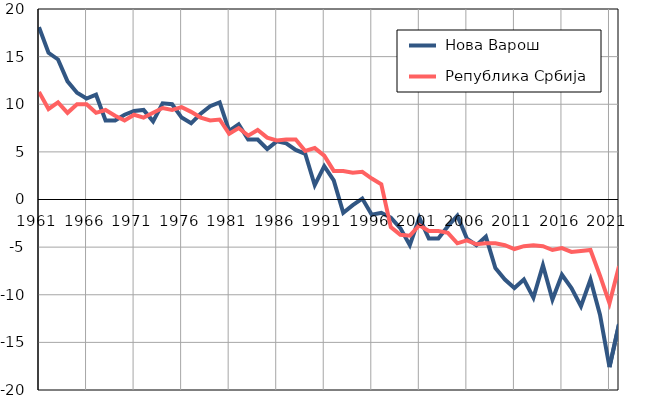
| Category |  Нова Варош |  Република Србија |
|---|---|---|
| 1961.0 | 18.1 | 11.3 |
| 1962.0 | 15.4 | 9.5 |
| 1963.0 | 14.7 | 10.2 |
| 1964.0 | 12.4 | 9.1 |
| 1965.0 | 11.2 | 10 |
| 1966.0 | 10.6 | 10 |
| 1967.0 | 11 | 9.1 |
| 1968.0 | 8.3 | 9.4 |
| 1969.0 | 8.3 | 8.8 |
| 1970.0 | 8.9 | 8.3 |
| 1971.0 | 9.3 | 8.9 |
| 1972.0 | 9.4 | 8.6 |
| 1973.0 | 8.2 | 9.1 |
| 1974.0 | 10.1 | 9.6 |
| 1975.0 | 10 | 9.4 |
| 1976.0 | 8.6 | 9.7 |
| 1977.0 | 8 | 9.2 |
| 1978.0 | 9 | 8.6 |
| 1979.0 | 9.8 | 8.3 |
| 1980.0 | 10.2 | 8.4 |
| 1981.0 | 7.2 | 6.9 |
| 1982.0 | 7.9 | 7.5 |
| 1983.0 | 6.3 | 6.7 |
| 1984.0 | 6.3 | 7.3 |
| 1985.0 | 5.3 | 6.5 |
| 1986.0 | 6.1 | 6.2 |
| 1987.0 | 5.9 | 6.3 |
| 1988.0 | 5.2 | 6.3 |
| 1989.0 | 4.8 | 5.1 |
| 1990.0 | 1.5 | 5.4 |
| 1991.0 | 3.5 | 4.6 |
| 1992.0 | 2 | 3 |
| 1993.0 | -1.4 | 3 |
| 1994.0 | -0.6 | 2.8 |
| 1995.0 | 0.1 | 2.9 |
| 1996.0 | -1.6 | 2.2 |
| 1997.0 | -1.4 | 1.6 |
| 1998.0 | -1.9 | -2.9 |
| 1999.0 | -3 | -3.7 |
| 2000.0 | -4.8 | -3.8 |
| 2001.0 | -1.9 | -2.7 |
| 2002.0 | -4.1 | -3.3 |
| 2003.0 | -4.1 | -3.3 |
| 2004.0 | -2.8 | -3.5 |
| 2005.0 | -1.7 | -4.6 |
| 2006.0 | -4.1 | -4.3 |
| 2007.0 | -4.8 | -4.7 |
| 2008.0 | -3.9 | -4.6 |
| 2009.0 | -7.2 | -4.6 |
| 2010.0 | -8.4 | -4.8 |
| 2011.0 | -9.3 | -5.2 |
| 2012.0 | -8.4 | -4.9 |
| 2013.0 | -10.3 | -4.8 |
| 2014.0 | -6.9 | -4.9 |
| 2015.0 | -10.5 | -5.3 |
| 2016.0 | -7.9 | -5.1 |
| 2017.0 | -9.3 | -5.5 |
| 2018.0 | -11.2 | -5.4 |
| 2019.0 | -8.4 | -5.3 |
| 2020.0 | -12.1 | -8 |
| 2021.0 | -17.6 | -10.9 |
| 2022.0 | -13.1 | -7 |